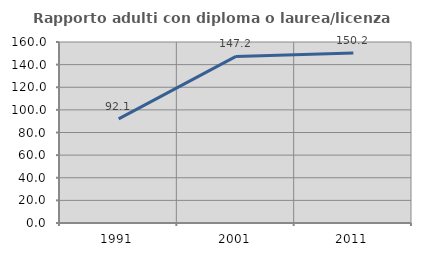
| Category | Rapporto adulti con diploma o laurea/licenza media  |
|---|---|
| 1991.0 | 92.099 |
| 2001.0 | 147.25 |
| 2011.0 | 150.213 |